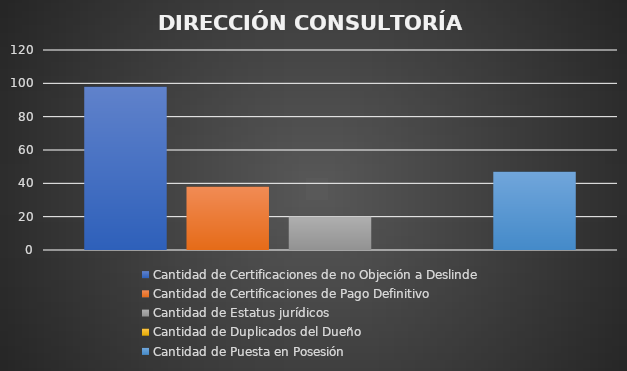
| Category | Cantidad de Certificaciones de no Objeción a Deslinde | Cantidad de Certificaciones de Pago Definitivo  | Cantidad de Estatus jurídicos | Cantidad de Duplicados del Dueño | Cantidad de Puesta en Posesión  |
|---|---|---|---|---|---|
| 0 | 98 | 38 | 20 | 0 | 47 |